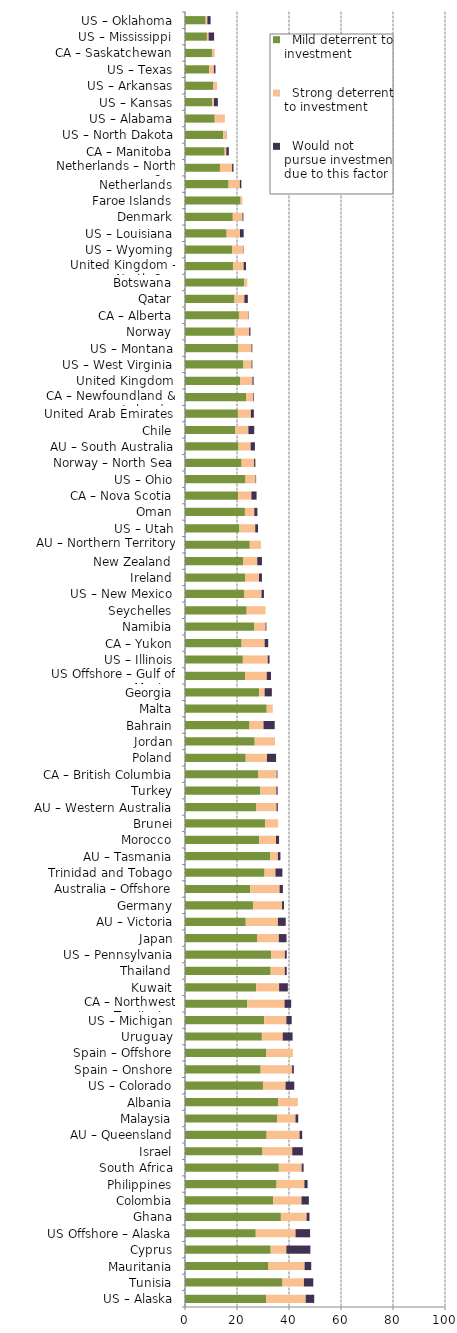
| Category |   Mild deterrent to investment |   Strong deterrent to investment |   Would not pursue investment due to this factor |
|---|---|---|---|
| US – Alaska | 31.296 | 15.136 | 3.273 |
| Tunisia | 37.511 | 8.224 | 3.611 |
| Mauritania | 31.941 | 14.054 | 2.555 |
| Cyprus | 32.95 | 6.028 | 9.242 |
| US Offshore – Alaska | 27.226 | 15.291 | 5.594 |
| Ghana | 36.875 | 9.907 | 1.101 |
| Colombia | 33.913 | 10.894 | 2.842 |
| Philippines | 35.209 | 10.707 | 1.235 |
| South Africa | 36.092 | 8.772 | 0.752 |
| Israel | 29.815 | 11.436 | 4.084 |
| AU – Queensland | 31.395 | 12.659 | 1.013 |
| Malaysia | 35.439 | 7.049 | 1.062 |
| Albania | 35.861 | 7.55 | 0 |
| US – Colorado | 29.984 | 8.683 | 3.357 |
| Spain – Onshore | 29.099 | 12.097 | 0.654 |
| Spain – Offshore | 31.307 | 10.216 | 0 |
| Uruguay | 29.559 | 8.023 | 3.8 |
| US – Michigan | 30.483 | 8.5 | 2.052 |
| CA – Northwest Territories | 23.995 | 14.295 | 2.553 |
| Kuwait | 27.355 | 8.838 | 3.367 |
| Thailand | 32.963 | 5.432 | 0.741 |
| US – Pennsylvania | 33.16 | 5.263 | 0.702 |
| Japan | 27.682 | 8.403 | 2.966 |
| AU – Victoria | 23.377 | 12.357 | 3.006 |
| Germany | 26.244 | 11.089 | 0.739 |
| Australia – Offshore | 25.1 | 11.272 | 1.278 |
| Trinidad and Tobago | 30.599 | 4.18 | 2.675 |
| AU – Tasmania | 32.832 | 2.897 | 0.966 |
| Morocco | 28.473 | 6.525 | 1.186 |
| Brunei | 30.764 | 5.043 | 0 |
| AU – Western Australia | 27.423 | 7.761 | 0.517 |
| Turkey | 28.992 | 6.142 | 0.491 |
| CA – British Columbia | 28.24 | 7.037 | 0.274 |
| Poland | 23.357 | 8.175 | 3.503 |
| Jordan | 26.817 | 7.786 | 0 |
| Bahrain | 24.806 | 5.393 | 4.314 |
| Malta | 31.433 | 2.328 | 0 |
| Georgia | 28.532 | 2.088 | 2.784 |
| US Offshore – Gulf of Mexico | 23.137 | 8.297 | 1.636 |
| US – Illinois | 22.244 | 9.582 | 0.684 |
| CA – Yukon | 21.782 | 8.849 | 1.361 |
| Namibia | 26.693 | 4.284 | 0.33 |
| Seychelles | 23.727 | 7.25 | 0 |
| US – New Mexico | 22.848 | 6.573 | 0.939 |
| Ireland | 23.068 | 5.383 | 1.153 |
| New Zealand | 22.335 | 5.448 | 1.816 |
| AU – Northern Territory | 24.914 | 4.333 | 0 |
| US – Utah | 20.907 | 6.098 | 1.089 |
| Oman | 23.042 | 3.6 | 1.2 |
| CA – Nova Scotia | 20.43 | 5.108 | 1.986 |
| US – Ohio | 23.29 | 3.846 | 0.214 |
| Norway – North Sea | 21.779 | 4.785 | 0.495 |
| AU – South Australia | 20.595 | 4.651 | 1.661 |
| Chile | 19.407 | 4.965 | 2.257 |
| United Arab Emirates | 20.346 | 4.99 | 1.152 |
| CA – Newfoundland & Labrador | 23.553 | 2.617 | 0.262 |
| United Kingdom | 21.188 | 4.767 | 0.441 |
| US – West Virginia | 22.479 | 3.122 | 0.312 |
| US – Montana | 20.552 | 5.02 | 0.314 |
| Norway | 19.127 | 5.558 | 0.49 |
| CA – Alberta | 20.746 | 3.577 | 0.143 |
| Qatar | 19.062 | 3.768 | 1.33 |
| Botswana | 22.758 | 1.198 | 0 |
| United Kingdom – North Sea | 18.448 | 4.11 | 0.913 |
| US – Wyoming | 18.103 | 4.418 | 0.108 |
| US – Louisiana | 16.028 | 5.132 | 1.406 |
| Denmark | 18.379 | 3.744 | 0.34 |
| Faroe Islands | 21.376 | 0.737 | 0 |
| Netherlands | 16.763 | 4.335 | 0.578 |
| Netherlands – North Sea | 13.445 | 4.664 | 0.549 |
| CA – Manitoba | 15.247 | 0.649 | 0.973 |
| US – North Dakota | 14.698 | 1.102 | 0.122 |
| US – Alabama | 11.443 | 3.901 | 0 |
| US – Kansas | 10.438 | 0.687 | 1.511 |
| US – Arkansas | 10.943 | 1.397 | 0 |
| US – Texas | 9.289 | 1.826 | 0.595 |
| CA – Saskatchewan | 10.361 | 1.072 | 0 |
| US – Mississippi | 8.434 | 0.649 | 2.109 |
| US – Oklahoma | 7.945 | 0.662 | 1.23 |